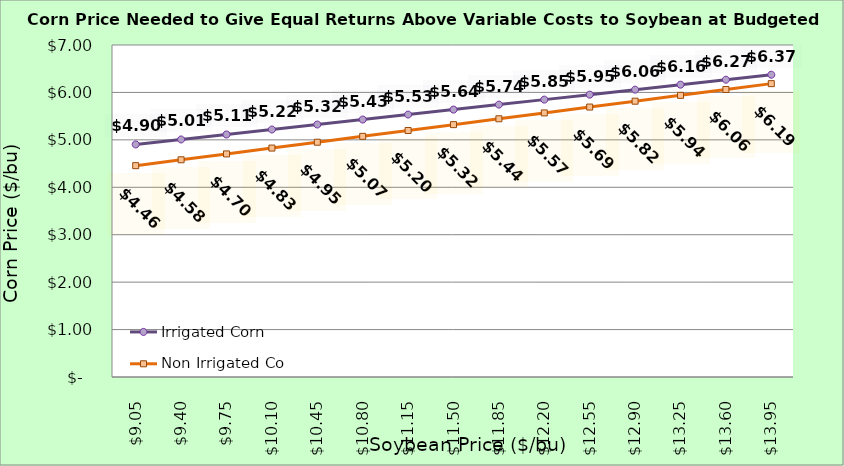
| Category | Irrigated Corn | Non Irrigated Corn |
|---|---|---|
| 9.050000000000002 | 4.903 | 4.456 |
| 9.400000000000002 | 5.008 | 4.58 |
| 9.750000000000002 | 5.113 | 4.703 |
| 10.100000000000001 | 5.218 | 4.827 |
| 10.450000000000001 | 5.323 | 4.95 |
| 10.8 | 5.428 | 5.074 |
| 11.15 | 5.533 | 5.197 |
| 11.5 | 5.638 | 5.321 |
| 11.85 | 5.743 | 5.444 |
| 12.2 | 5.848 | 5.568 |
| 12.549999999999999 | 5.953 | 5.691 |
| 12.899999999999999 | 6.058 | 5.815 |
| 13.249999999999998 | 6.163 | 5.939 |
| 13.599999999999998 | 6.268 | 6.062 |
| 13.949999999999998 | 6.373 | 6.186 |